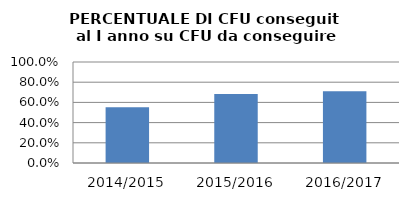
| Category | 2014/2015 2015/2016 2016/2017 |
|---|---|
| 2014/2015 | 0.552 |
| 2015/2016 | 0.683 |
| 2016/2017 | 0.71 |